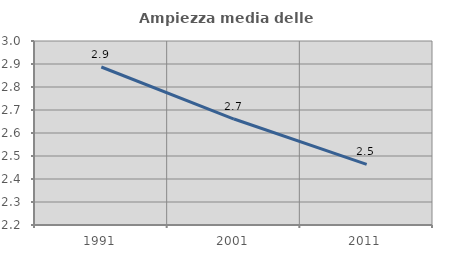
| Category | Ampiezza media delle famiglie |
|---|---|
| 1991.0 | 2.887 |
| 2001.0 | 2.661 |
| 2011.0 | 2.464 |